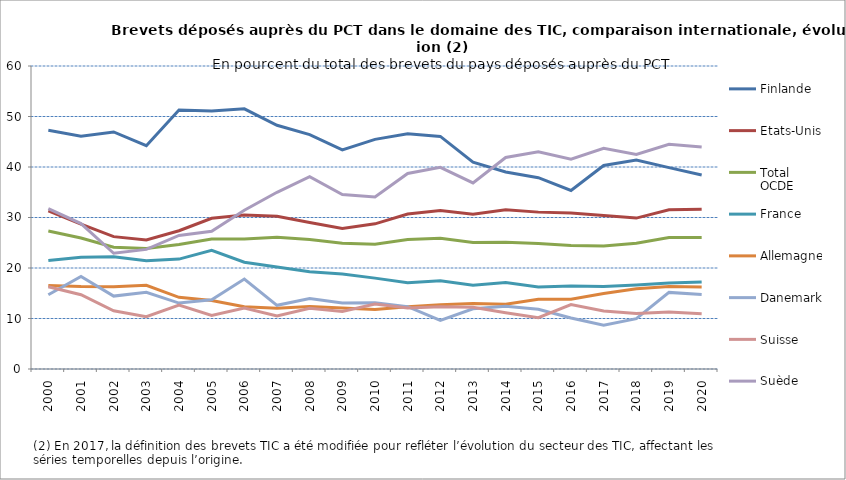
| Category | Finlande | Etats-Unis | Total OCDE | France | Allemagne | Danemark | Suisse | Suède |
|---|---|---|---|---|---|---|---|---|
| 2000.0 | 47.281 | 31.308 | 27.341 | 21.471 | 16.527 | 14.696 | 16.285 | 31.75 |
| 2001.0 | 46.116 | 28.694 | 25.929 | 22.123 | 16.328 | 18.321 | 14.709 | 28.789 |
| 2002.0 | 46.944 | 26.21 | 24.105 | 22.207 | 16.28 | 14.436 | 11.525 | 22.913 |
| 2003.0 | 44.214 | 25.557 | 23.859 | 21.458 | 16.585 | 15.189 | 10.367 | 23.685 |
| 2004.0 | 51.283 | 27.371 | 24.655 | 21.765 | 14.189 | 13.052 | 12.639 | 26.444 |
| 2005.0 | 51.07 | 29.853 | 25.75 | 23.489 | 13.581 | 13.702 | 10.591 | 27.29 |
| 2006.0 | 51.525 | 30.502 | 25.752 | 21.14 | 12.311 | 17.822 | 12.069 | 31.442 |
| 2007.0 | 48.255 | 30.247 | 26.069 | 20.198 | 12.015 | 12.611 | 10.52 | 34.989 |
| 2008.0 | 46.413 | 29.001 | 25.642 | 19.244 | 12.355 | 13.968 | 12.04 | 38.07 |
| 2009.0 | 43.378 | 27.831 | 24.919 | 18.796 | 12.056 | 13.061 | 11.382 | 34.552 |
| 2010.0 | 45.477 | 28.749 | 24.724 | 17.993 | 11.804 | 13.123 | 12.871 | 34.056 |
| 2011.0 | 46.561 | 30.675 | 25.634 | 17.099 | 12.35 | 12.334 | 12.103 | 38.713 |
| 2012.0 | 46.057 | 31.396 | 25.877 | 17.454 | 12.736 | 9.636 | 12.313 | 39.936 |
| 2013.0 | 40.952 | 30.666 | 25.03 | 16.584 | 12.963 | 11.915 | 12.248 | 36.85 |
| 2014.0 | 39.026 | 31.539 | 25.086 | 17.141 | 12.828 | 12.43 | 11.157 | 41.881 |
| 2015.0 | 37.883 | 31.064 | 24.871 | 16.254 | 13.813 | 11.816 | 10.162 | 43.016 |
| 2016.0 | 35.35 | 30.877 | 24.475 | 16.434 | 13.819 | 10.105 | 12.765 | 41.56 |
| 2017.0 | 40.309 | 30.415 | 24.342 | 16.335 | 14.933 | 8.672 | 11.484 | 43.703 |
| 2018.0 | 41.39 | 29.885 | 24.92 | 16.618 | 15.88 | 9.979 | 11.001 | 42.5 |
| 2019.0 | 39.88 | 31.543 | 26.05 | 17.006 | 16.354 | 15.173 | 11.27 | 44.505 |
| 2020.0 | 38.405 | 31.622 | 26.058 | 17.221 | 16.233 | 14.752 | 10.924 | 43.967 |